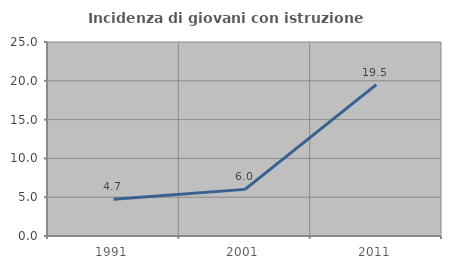
| Category | Incidenza di giovani con istruzione universitaria |
|---|---|
| 1991.0 | 4.743 |
| 2001.0 | 6.009 |
| 2011.0 | 19.512 |